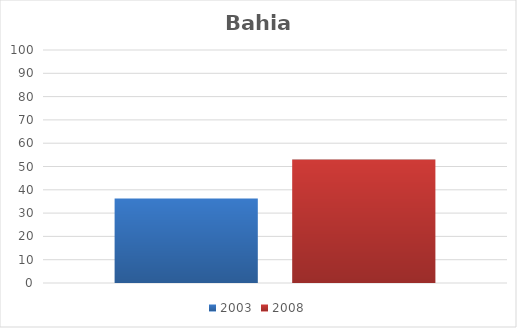
| Category | 2003 | 2008 |
|---|---|---|
| Total | 36.3 | 53 |